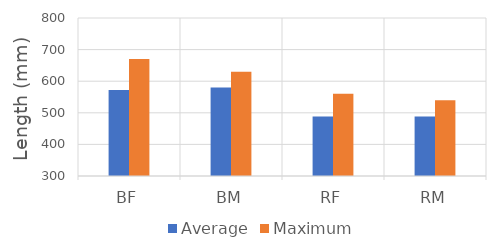
| Category | Average | Maximum |
|---|---|---|
| BF | 572 | 670 |
| BM | 580 | 630 |
| RF | 488 | 560 |
| RM | 488 | 540 |